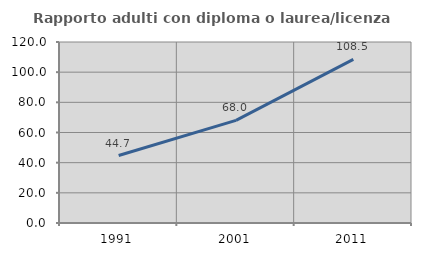
| Category | Rapporto adulti con diploma o laurea/licenza media  |
|---|---|
| 1991.0 | 44.737 |
| 2001.0 | 68.022 |
| 2011.0 | 108.49 |